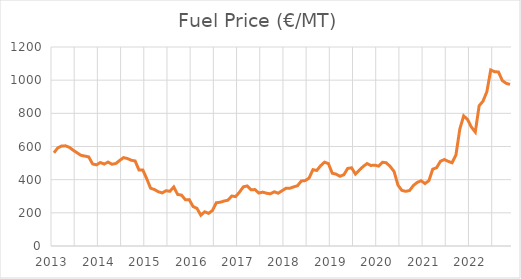
| Category | Fuel Price |
|---|---|
| 2013.0 | 562.1 |
| 2013.0 | 591.6 |
| 2013.0 | 602.85 |
| 2013.0 | 603.95 |
| 2013.0 | 594.9 |
| 2013.0 | 577.3 |
| 2013.0 | 561.9 |
| 2013.0 | 546.75 |
| 2013.0 | 542.15 |
| 2013.0 | 537.35 |
| 2013.0 | 494.95 |
| 2013.0 | 489.2 |
| 2014.0 | 503.3 |
| 2014.0 | 494.15 |
| 2014.0 | 506 |
| 2014.0 | 493.05 |
| 2014.0 | 497.1 |
| 2014.0 | 515.75 |
| 2014.0 | 532.9 |
| 2014.0 | 527.6 |
| 2014.0 | 517.05 |
| 2014.0 | 512.8 |
| 2014.0 | 458.45 |
| 2014.0 | 458.1 |
| 2015.0 | 405.95 |
| 2015.0 | 348.65 |
| 2015.0 | 340.5 |
| 2015.0 | 327.35 |
| 2015.0 | 320.2 |
| 2015.0 | 333.4 |
| 2015.0 | 329.8 |
| 2015.0 | 355.95 |
| 2015.0 | 310.9 |
| 2015.0 | 306.95 |
| 2015.0 | 279.25 |
| 2015.0 | 279.6 |
| 2016.0 | 237.75 |
| 2016.0 | 227.2 |
| 2016.0 | 185.5 |
| 2016.0 | 206.4 |
| 2016.0 | 196.95 |
| 2016.0 | 213.7 |
| 2016.0 | 260.75 |
| 2016.0 | 263.75 |
| 2016.0 | 271 |
| 2016.0 | 276.05 |
| 2016.0 | 301.35 |
| 2016.0 | 297.75 |
| 2017.0 | 324.75 |
| 2017.0 | 356.85 |
| 2017.0 | 362.05 |
| 2017.0 | 339.05 |
| 2017.0 | 340.2 |
| 2017.0 | 319.55 |
| 2017.0 | 324.85 |
| 2017.0 | 318.2 |
| 2017.0 | 314.7 |
| 2017.0 | 327 |
| 2017.0 | 318.2 |
| 2017.0 | 332.95 |
| 2018.0 | 347.75 |
| 2018.0 | 347.88 |
| 2018.0 | 356.29 |
| 2018.0 | 363.31 |
| 2018.0 | 391.92 |
| 2018.0 | 394.42 |
| 2018.0 | 409.36 |
| 2018.0 | 460.37 |
| 2018.0 | 455.47 |
| 2018.0 | 484.29 |
| 2018.0 | 505.47 |
| 2018.0 | 496.81 |
| 2019.0 | 439.15 |
| 2019.0 | 433.24 |
| 2019.0 | 420.39 |
| 2019.0 | 429.6 |
| 2019.0 | 467.97 |
| 2019.0 | 471.41 |
| 2019.0 | 433.97 |
| 2019.0 | 457.92 |
| 2019.0 | 479.4 |
| 2019.0 | 497.16 |
| 2019.0 | 485.64 |
| 2019.0 | 487.54 |
| 2020.0 | 481.63 |
| 2020.0 | 505.02 |
| 2020.0 | 501.73 |
| 2020.0 | 479.04 |
| 2020.0 | 449.12 |
| 2020.0 | 367.01 |
| 2020.0 | 335.41 |
| 2020.0 | 329.81 |
| 2020.0 | 334.59 |
| 2020.0 | 365.1 |
| 2020.0 | 383.66 |
| 2020.0 | 393.35 |
| 2021.0 | 376.47 |
| 2021.0 | 394.22 |
| 2021.0 | 463.24 |
| 2021.0 | 472.31 |
| 2021.0 | 511.12 |
| 2021.0 | 521.31 |
| 2021.0 | 510.42 |
| 2021.0 | 501.69 |
| 2021.0 | 549.06 |
| 2021.0 | 705.16 |
| 2021.0 | 784.59 |
| 2021.0 | 762.96 |
| 2022.0 | 716.93 |
| 2022.0 | 687.06 |
| 2022.0 | 845.4 |
| 2022.0 | 873.58 |
| 2022.0 | 930.29 |
| 2022.0 | 1061.5 |
| 2022.0 | 1050.8 |
| 2022.0 | 1049.47 |
| 2022.0 | 997.33 |
| 2022.0 | 980.8 |
| 2022.0 | 974.54 |